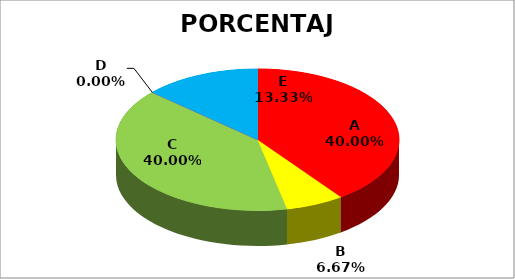
| Category | Series 0 |
|---|---|
| A | 6 |
| B | 1 |
| C | 6 |
| D | 0 |
| E | 2 |